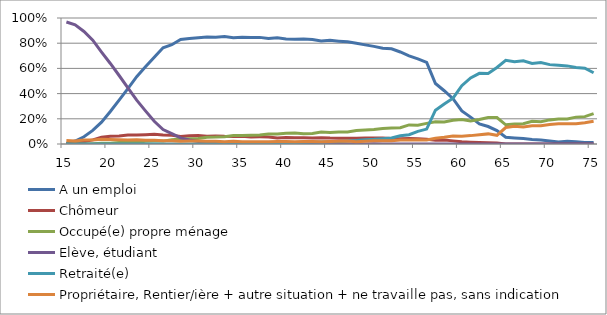
| Category | A un emploi | Chômeur | Occupé(e) propre ménage | Elève, étudiant | Retraité(e) | Propriétaire, Rentier/ière + autre situation + ne travaille pas, sans indication |
|---|---|---|---|---|---|---|
| 15.0 | 0.004 | 0 | 0 | 0.968 | 0 | 0.028 |
| 16.0 | 0.023 | 0.007 | 0 | 0.946 | 0 | 0.024 |
| 17.0 | 0.058 | 0.018 | 0 | 0.893 | 0 | 0.031 |
| 18.0 | 0.108 | 0.033 | 0.003 | 0.824 | 0 | 0.033 |
| 19.0 | 0.174 | 0.053 | 0.005 | 0.73 | 0 | 0.038 |
| 20.0 | 0.258 | 0.062 | 0.006 | 0.639 | 0 | 0.036 |
| 21.0 | 0.348 | 0.064 | 0.011 | 0.544 | 0 | 0.033 |
| 22.0 | 0.44 | 0.072 | 0.012 | 0.446 | 0 | 0.031 |
| 23.0 | 0.534 | 0.072 | 0.012 | 0.348 | 0.001 | 0.033 |
| 24.0 | 0.613 | 0.074 | 0.021 | 0.263 | 0.001 | 0.029 |
| 25.0 | 0.689 | 0.077 | 0.023 | 0.18 | 0.001 | 0.03 |
| 26.0 | 0.764 | 0.071 | 0.023 | 0.115 | 0.001 | 0.026 |
| 27.0 | 0.788 | 0.07 | 0.033 | 0.082 | 0.001 | 0.026 |
| 28.0 | 0.829 | 0.06 | 0.039 | 0.049 | 0 | 0.023 |
| 29.0 | 0.837 | 0.066 | 0.041 | 0.032 | 0.001 | 0.024 |
| 30.0 | 0.844 | 0.067 | 0.044 | 0.02 | 0.001 | 0.024 |
| 31.0 | 0.849 | 0.061 | 0.054 | 0.013 | 0.002 | 0.021 |
| 32.0 | 0.846 | 0.064 | 0.055 | 0.011 | 0.001 | 0.022 |
| 33.0 | 0.853 | 0.061 | 0.058 | 0.007 | 0.002 | 0.018 |
| 34.0 | 0.843 | 0.06 | 0.067 | 0.005 | 0.002 | 0.022 |
| 35.0 | 0.847 | 0.061 | 0.067 | 0.004 | 0.004 | 0.017 |
| 36.0 | 0.846 | 0.056 | 0.07 | 0.003 | 0.006 | 0.019 |
| 37.0 | 0.846 | 0.057 | 0.071 | 0.002 | 0.005 | 0.019 |
| 38.0 | 0.837 | 0.056 | 0.079 | 0.002 | 0.007 | 0.019 |
| 39.0 | 0.843 | 0.048 | 0.08 | 0.002 | 0.008 | 0.019 |
| 40.0 | 0.834 | 0.051 | 0.086 | 0.001 | 0.008 | 0.02 |
| 41.0 | 0.832 | 0.049 | 0.086 | 0.002 | 0.012 | 0.018 |
| 42.0 | 0.833 | 0.05 | 0.082 | 0.001 | 0.014 | 0.019 |
| 43.0 | 0.83 | 0.048 | 0.084 | 0.002 | 0.016 | 0.02 |
| 44.0 | 0.818 | 0.05 | 0.095 | 0.001 | 0.017 | 0.019 |
| 45.0 | 0.823 | 0.047 | 0.091 | 0.001 | 0.018 | 0.021 |
| 46.0 | 0.816 | 0.046 | 0.095 | 0.001 | 0.02 | 0.021 |
| 47.0 | 0.811 | 0.046 | 0.095 | 0.001 | 0.024 | 0.024 |
| 48.0 | 0.8 | 0.046 | 0.107 | 0.001 | 0.028 | 0.019 |
| 49.0 | 0.787 | 0.047 | 0.11 | 0 | 0.034 | 0.021 |
| 50.0 | 0.775 | 0.047 | 0.115 | 0.001 | 0.037 | 0.025 |
| 51.0 | 0.76 | 0.047 | 0.124 | 0.001 | 0.043 | 0.026 |
| 52.0 | 0.755 | 0.044 | 0.126 | 0 | 0.047 | 0.027 |
| 53.0 | 0.73 | 0.043 | 0.13 | 0 | 0.066 | 0.032 |
| 54.0 | 0.7 | 0.043 | 0.152 | 0 | 0.073 | 0.032 |
| 55.0 | 0.675 | 0.042 | 0.149 | 0 | 0.1 | 0.035 |
| 56.0 | 0.647 | 0.039 | 0.164 | 0 | 0.118 | 0.032 |
| 57.0 | 0.48 | 0.03 | 0.176 | 0 | 0.268 | 0.046 |
| 58.0 | 0.423 | 0.032 | 0.175 | 0 | 0.317 | 0.053 |
| 59.0 | 0.36 | 0.025 | 0.189 | 0 | 0.363 | 0.063 |
| 60.0 | 0.263 | 0.018 | 0.195 | 0 | 0.463 | 0.062 |
| 61.0 | 0.213 | 0.014 | 0.182 | 0 | 0.524 | 0.066 |
| 62.0 | 0.16 | 0.012 | 0.194 | 0 | 0.561 | 0.074 |
| 63.0 | 0.139 | 0.011 | 0.21 | 0 | 0.56 | 0.08 |
| 64.0 | 0.106 | 0.007 | 0.21 | 0 | 0.607 | 0.069 |
| 65.0 | 0.053 | 0 | 0.152 | 0 | 0.664 | 0.131 |
| 66.0 | 0.048 | 0 | 0.158 | 0 | 0.653 | 0.141 |
| 67.0 | 0.043 | 0 | 0.161 | 0 | 0.66 | 0.136 |
| 68.0 | 0.036 | 0 | 0.18 | 0 | 0.639 | 0.145 |
| 69.0 | 0.031 | 0 | 0.177 | 0 | 0.647 | 0.145 |
| 70.0 | 0.024 | 0 | 0.191 | 0 | 0.63 | 0.154 |
| 71.0 | 0.016 | 0 | 0.199 | 0 | 0.625 | 0.16 |
| 72.0 | 0.022 | 0 | 0.198 | 0 | 0.62 | 0.16 |
| 73.0 | 0.018 | 0 | 0.213 | 0 | 0.608 | 0.161 |
| 74.0 | 0.013 | 0 | 0.217 | 0 | 0.602 | 0.168 |
| 75.0 | 0.012 | 0 | 0.241 | 0 | 0.565 | 0.181 |